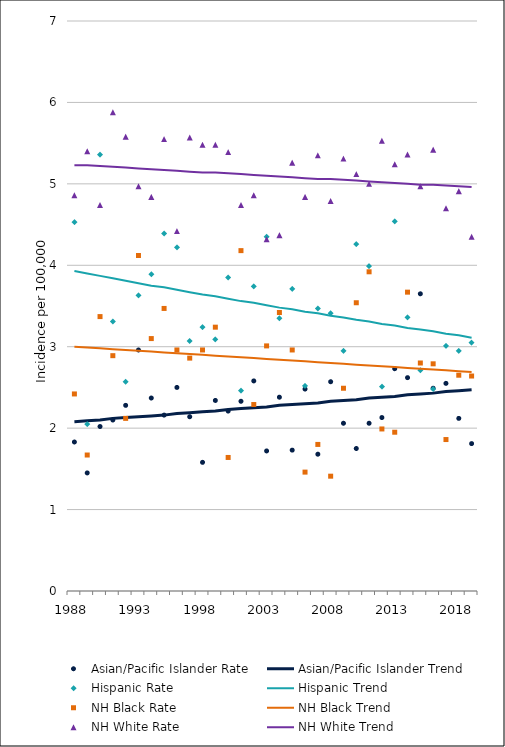
| Category | Asian/Pacific Islander Rate | Asian/Pacific Islander Trend | Hispanic Rate | Hispanic Trend | NH Black Rate | NH Black Trend | NH White Rate | NH White Trend |
|---|---|---|---|---|---|---|---|---|
| 1988.0 | 1.83 | 2.08 | 4.53 | 3.93 | 2.42 | 3 | 4.86 | 5.23 |
| 1989.0 | 1.45 | 2.09 | 2.05 | 3.9 | 1.67 | 2.99 | 5.4 | 5.23 |
| 1990.0 | 2.02 | 2.1 | 5.36 | 3.87 | 3.37 | 2.98 | 4.74 | 5.22 |
| 1991.0 | 2.1 | 2.12 | 3.31 | 3.84 | 2.89 | 2.97 | 5.88 | 5.21 |
| 1992.0 | 2.28 | 2.13 | 2.57 | 3.81 | 2.12 | 2.96 | 5.58 | 5.2 |
| 1993.0 | 2.96 | 2.14 | 3.63 | 3.78 | 4.12 | 2.95 | 4.97 | 5.19 |
| 1994.0 | 2.37 | 2.15 | 3.89 | 3.75 | 3.1 | 2.94 | 4.84 | 5.18 |
| 1995.0 | 2.16 | 2.16 | 4.39 | 3.73 | 3.47 | 2.93 | 5.55 | 5.17 |
| 1996.0 | 2.5 | 2.18 | 4.22 | 3.7 | 2.96 | 2.92 | 4.42 | 5.16 |
| 1997.0 | 2.14 | 2.19 | 3.07 | 3.67 | 2.86 | 2.91 | 5.57 | 5.15 |
| 1998.0 | 1.58 | 2.2 | 3.24 | 3.64 | 2.96 | 2.9 | 5.48 | 5.14 |
| 1999.0 | 2.34 | 2.21 | 3.09 | 3.62 | 3.24 | 2.89 | 5.48 | 5.14 |
| 2000.0 | 2.21 | 2.23 | 3.85 | 3.59 | 1.64 | 2.88 | 5.39 | 5.13 |
| 2001.0 | 2.33 | 2.24 | 2.46 | 3.56 | 4.18 | 2.87 | 4.74 | 5.12 |
| 2002.0 | 2.58 | 2.25 | 3.74 | 3.54 | 2.29 | 2.86 | 4.86 | 5.11 |
| 2003.0 | 1.72 | 2.26 | 4.35 | 3.51 | 3.01 | 2.85 | 4.32 | 5.1 |
| 2004.0 | 2.38 | 2.28 | 3.35 | 3.48 | 3.42 | 2.84 | 4.37 | 5.09 |
| 2005.0 | 1.73 | 2.29 | 3.71 | 3.46 | 2.96 | 2.83 | 5.26 | 5.08 |
| 2006.0 | 2.48 | 2.3 | 2.52 | 3.43 | 1.46 | 2.82 | 4.84 | 5.07 |
| 2007.0 | 1.68 | 2.31 | 3.47 | 3.41 | 1.8 | 2.81 | 5.35 | 5.06 |
| 2008.0 | 2.57 | 2.33 | 3.41 | 3.38 | 1.41 | 2.8 | 4.79 | 5.06 |
| 2009.0 | 2.06 | 2.34 | 2.95 | 3.36 | 2.49 | 2.79 | 5.31 | 5.05 |
| 2010.0 | 1.75 | 2.35 | 4.26 | 3.33 | 3.54 | 2.78 | 5.12 | 5.04 |
| 2011.0 | 2.06 | 2.37 | 3.99 | 3.31 | 3.92 | 2.77 | 5 | 5.03 |
| 2012.0 | 2.13 | 2.38 | 2.51 | 3.28 | 1.99 | 2.76 | 5.53 | 5.02 |
| 2013.0 | 2.73 | 2.39 | 4.54 | 3.26 | 1.95 | 2.75 | 5.24 | 5.01 |
| 2014.0 | 2.62 | 2.41 | 3.36 | 3.23 | 3.67 | 2.74 | 5.36 | 5 |
| 2015.0 | 3.65 | 2.42 | 2.71 | 3.21 | 2.8 | 2.73 | 4.97 | 4.99 |
| 2016.0 | 2.49 | 2.43 | 2.48 | 3.19 | 2.79 | 2.72 | 5.42 | 4.99 |
| 2017.0 | 2.55 | 2.45 | 3.01 | 3.16 | 1.86 | 2.71 | 4.7 | 4.98 |
| 2018.0 | 2.12 | 2.46 | 2.95 | 3.14 | 2.65 | 2.7 | 4.91 | 4.97 |
| 2019.0 | 1.81 | 2.47 | 3.05 | 3.11 | 2.64 | 2.69 | 4.35 | 4.96 |